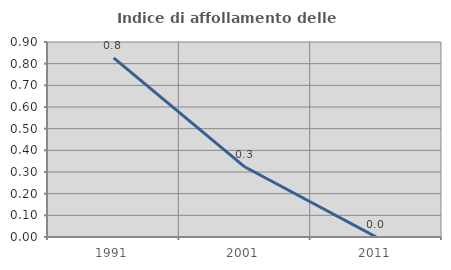
| Category | Indice di affollamento delle abitazioni  |
|---|---|
| 1991.0 | 0.826 |
| 2001.0 | 0.323 |
| 2011.0 | 0 |